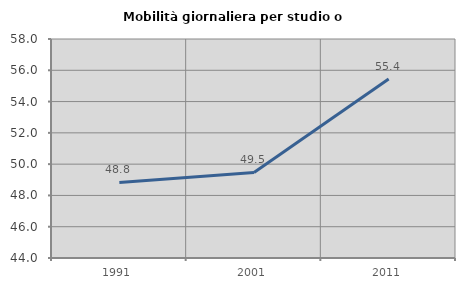
| Category | Mobilità giornaliera per studio o lavoro |
|---|---|
| 1991.0 | 48.829 |
| 2001.0 | 49.47 |
| 2011.0 | 55.444 |